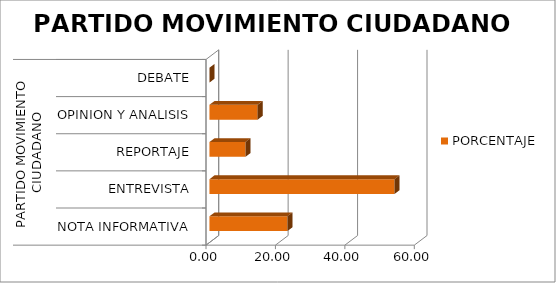
| Category | PORCENTAJE |
|---|---|
| 0 | 22.449 |
| 1 | 53.305 |
| 2 | 10.377 |
| 3 | 13.869 |
| 4 | 0 |